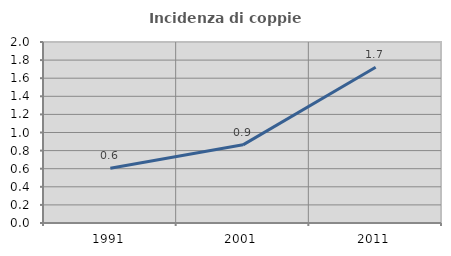
| Category | Incidenza di coppie miste |
|---|---|
| 1991.0 | 0.604 |
| 2001.0 | 0.864 |
| 2011.0 | 1.721 |